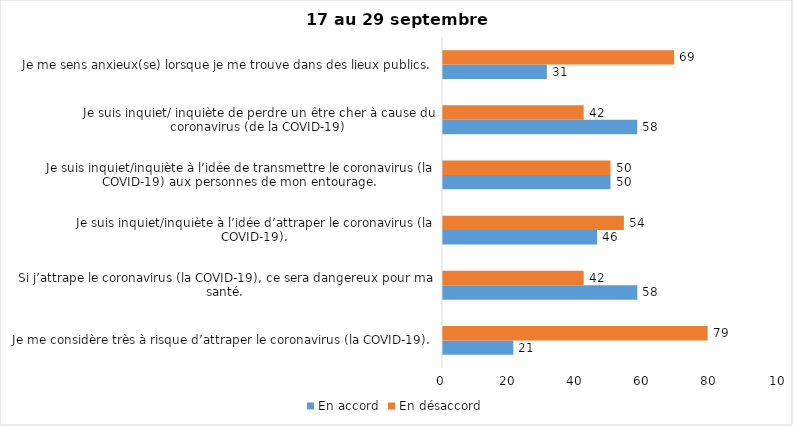
| Category | En accord | En désaccord |
|---|---|---|
| Je me considère très à risque d’attraper le coronavirus (la COVID-19). | 21 | 79 |
| Si j’attrape le coronavirus (la COVID-19), ce sera dangereux pour ma santé. | 58 | 42 |
| Je suis inquiet/inquiète à l’idée d’attraper le coronavirus (la COVID-19). | 46 | 54 |
| Je suis inquiet/inquiète à l’idée de transmettre le coronavirus (la COVID-19) aux personnes de mon entourage. | 50 | 50 |
| Je suis inquiet/ inquiète de perdre un être cher à cause du coronavirus (de la COVID-19) | 58 | 42 |
| Je me sens anxieux(se) lorsque je me trouve dans des lieux publics. | 31 | 69 |